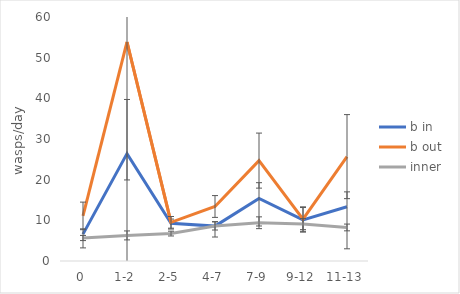
| Category | b in | b out | inner |
|---|---|---|---|
| 0 | 6.608 | 11.092 | 5.654 |
| 1-2 | 26.4 | 53.857 | 6.292 |
| 2-5 | 9.296 | 9.508 | 6.744 |
| 4-7 | 8.579 | 13.405 | 8.627 |
| 7-9 | 15.375 | 24.688 | 9.406 |
| 9-12 | 10.111 | 10.306 | 9.069 |
| 11-13 | 13.333 | 25.667 | 8.25 |